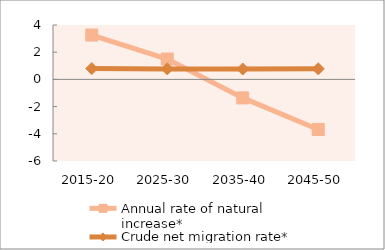
| Category | Annual rate of natural increase* | Crude net migration rate* |
|---|---|---|
| 2015-20 | 3.259 | 0.796 |
| 2025-30 | 1.496 | 0.771 |
| 2035-40 | -1.36 | 0.764 |
| 2045-50 | -3.681 | 0.778 |